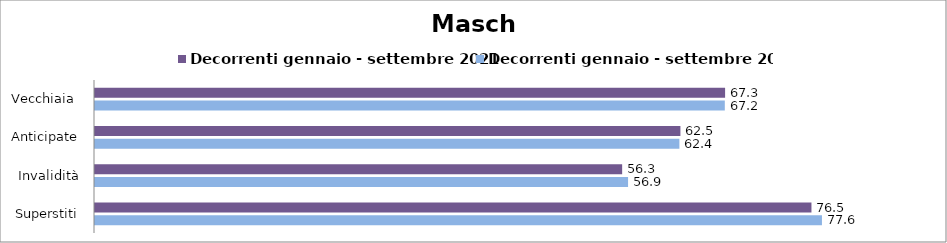
| Category | Decorrenti gennaio - settembre 2021 | Decorrenti gennaio - settembre 2022 |
|---|---|---|
| Vecchiaia  | 67.27 | 67.24 |
| Anticipate | 62.5 | 62.39 |
| Invalidità | 56.28 | 56.91 |
| Superstiti | 76.49 | 77.61 |